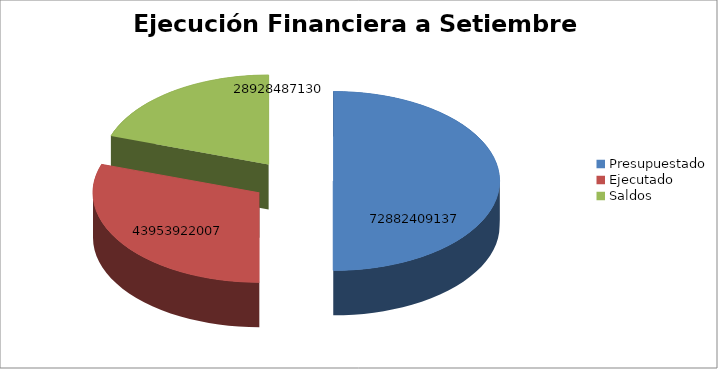
| Category | 4.8 Ejecución Financiera (Generar gráfica) |
|---|---|
| Presupuestado | 72882409137 |
| Ejecutado | 43953922007 |
| Saldos | 28928487130 |